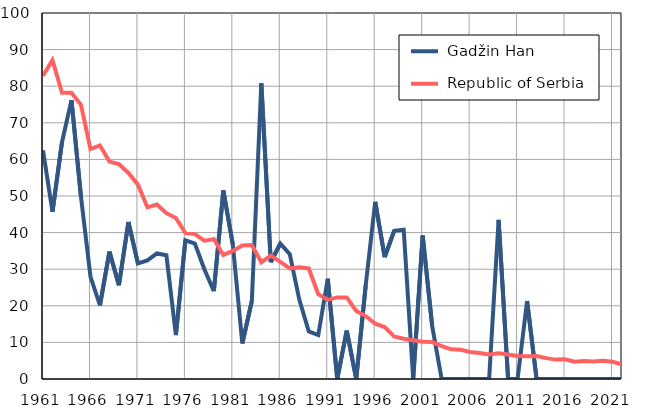
| Category |  Gadžin Han |  Republic of Serbia |
|---|---|---|
| 1961.0 | 62.5 | 82.9 |
| 1962.0 | 45.7 | 87.1 |
| 1963.0 | 64.7 | 78.2 |
| 1964.0 | 76.2 | 78.2 |
| 1965.0 | 49.8 | 74.9 |
| 1966.0 | 28 | 62.8 |
| 1967.0 | 20.1 | 63.8 |
| 1968.0 | 34.8 | 59.4 |
| 1969.0 | 25.6 | 58.7 |
| 1970.0 | 42.9 | 56.3 |
| 1971.0 | 31.6 | 53.1 |
| 1972.0 | 32.4 | 46.9 |
| 1973.0 | 34.3 | 47.7 |
| 1974.0 | 33.8 | 45.3 |
| 1975.0 | 12 | 44 |
| 1976.0 | 37.9 | 39.9 |
| 1977.0 | 37 | 39.6 |
| 1978.0 | 30 | 37.8 |
| 1979.0 | 24 | 38.2 |
| 1980.0 | 51.5 | 33.9 |
| 1981.0 | 36.7 | 35 |
| 1982.0 | 9.7 | 36.5 |
| 1983.0 | 21.3 | 36.6 |
| 1984.0 | 80.8 | 31.9 |
| 1985.0 | 31.9 | 33.7 |
| 1986.0 | 37 | 32 |
| 1987.0 | 34.1 | 30.2 |
| 1988.0 | 21.7 | 30.5 |
| 1989.0 | 13 | 30.2 |
| 1990.0 | 12 | 23.2 |
| 1991.0 | 27.4 | 21.6 |
| 1992.0 | 0 | 22.3 |
| 1993.0 | 13.2 | 22.3 |
| 1994.0 | 0 | 18.6 |
| 1995.0 | 25.6 | 17.2 |
| 1996.0 | 48.4 | 15.1 |
| 1997.0 | 33.3 | 14.2 |
| 1998.0 | 40.5 | 11.6 |
| 1999.0 | 40.8 | 11 |
| 2000.0 | 0 | 10.6 |
| 2001.0 | 39.2 | 10.2 |
| 2002.0 | 14.5 | 10.1 |
| 2003.0 | 0 | 9 |
| 2004.0 | 0 | 8.1 |
| 2005.0 | 0 | 8 |
| 2006.0 | 0 | 7.4 |
| 2007.0 | 0 | 7.1 |
| 2008.0 | 0 | 6.7 |
| 2009.0 | 43.5 | 7 |
| 2010.0 | 0 | 6.7 |
| 2011.0 | 0 | 6.3 |
| 2012.0 | 21.3 | 6.2 |
| 2013.0 | 0 | 6.3 |
| 2014.0 | 0 | 5.7 |
| 2015.0 | 0 | 5.3 |
| 2016.0 | 0 | 5.4 |
| 2017.0 | 0 | 4.7 |
| 2018.0 | 0 | 4.9 |
| 2019.0 | 0 | 4.8 |
| 2020.0 | 0 | 5 |
| 2021.0 | 0 | 4.7 |
| 2022.0 | 0 | 4 |